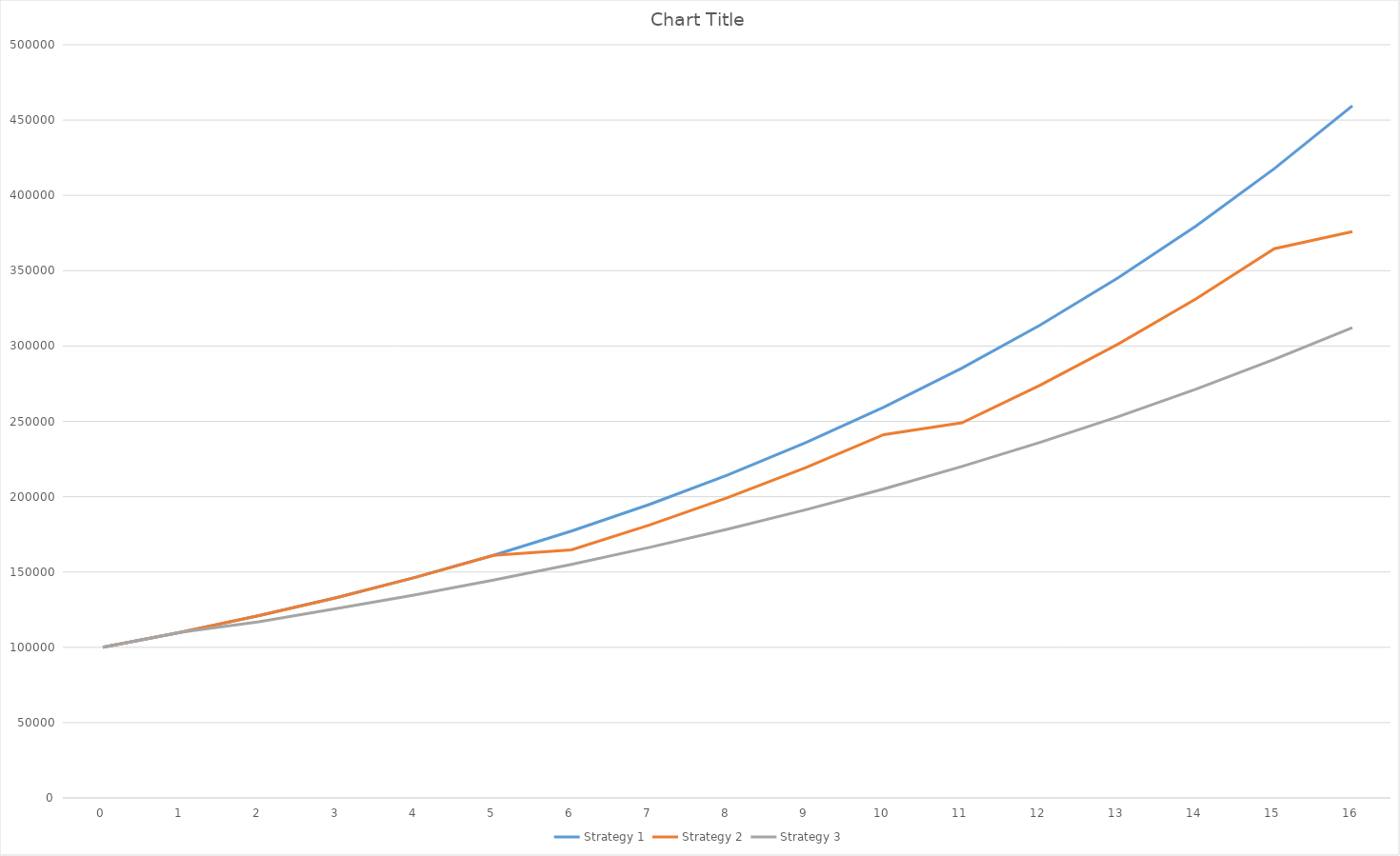
| Category | Strategy 1 | Strategy 2 | Strategy 3 |
|---|---|---|---|
| 0.0 | 100000 | 100000 | 100000 |
| 1.0 | 110000 | 110000 | 110000 |
| 2.0 | 121000 | 121000 | 116930 |
| 3.0 | 133100 | 133100 | 125802.49 |
| 4.0 | 146410 | 146410 | 134771.636 |
| 5.0 | 161051 | 161051 | 144598.357 |
| 6.0 | 177156.1 | 164732.222 | 155058.717 |
| 7.0 | 194871.71 | 181205.444 | 166307.222 |
| 8.0 | 214358.881 | 199325.988 | 178359.803 |
| 9.0 | 235794.769 | 219258.587 | 191290.383 |
| 10.0 | 259374.246 | 241184.445 | 205156.675 |
| 11.0 | 285311.671 | 248995.734 | 220028.761 |
| 12.0 | 313842.838 | 273895.307 | 235978.698 |
| 13.0 | 345227.121 | 301284.838 | 253084.944 |
| 14.0 | 379749.834 | 331413.322 | 271431.196 |
| 15.0 | 417724.817 | 364554.654 | 291107.391 |
| 16.0 | 459497.299 | 375904.282 | 312209.919 |